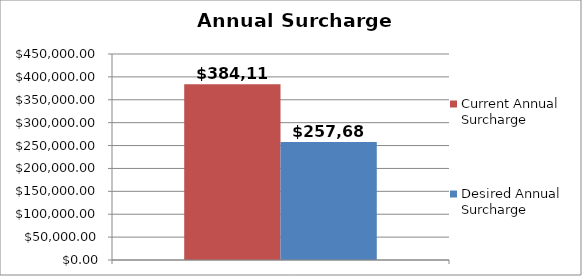
| Category | Current Annual Surcharge | Desired Annual Surcharge |
|---|---|---|
| 0 | 384119.027 | 257687.132 |